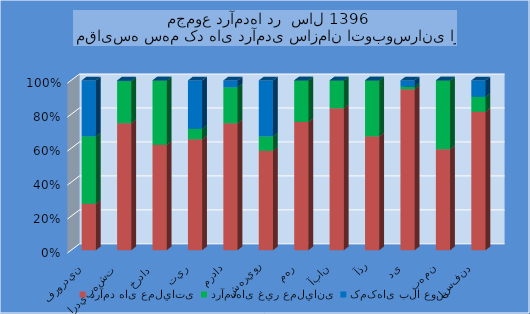
| Category | درآمد های عملياتی  | درآمدهای غير عمليانی  | کمکهای بلا عوض |
|---|---|---|---|
| فروردين | 582095 | 845000 | 700000 |
| ارديبهشت  | 1556011 | 515235 | 9000 |
| خرداد  | 2233422 | 1359950 | 0 |
| تير | 1037564 | 98350 | 452600 |
| مرداد | 1996119 | 565804 | 107567 |
| شهريور | 1324232 | 191920 | 744649 |
| مهر | 1435412 | 463838 | 0 |
| آبان | 2896469 | 568406 | 0 |
| آذر | 3671954 | 1803773 | 0 |
| دی | 5707479 | 97200 | 217451 |
| بهمن | 2009838 | 1365750 | 0 |
| اسفند | 3120205 | 337749 | 370000 |